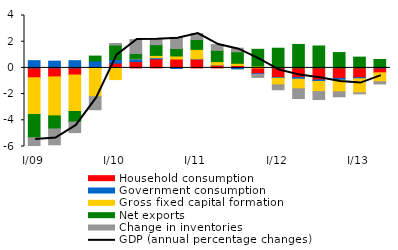
| Category | Household consumption | Government consumption | Gross fixed capital formation | Net exports | Change in inventories |
|---|---|---|---|---|---|
| I/09 | -0.752 | 0.551 | -2.809 | -1.77 | -0.69 |
| II | -0.686 | 0.517 | -2.976 | -0.996 | -1.21 |
| III | -0.544 | 0.549 | -2.783 | -0.804 | -0.809 |
| IV | -0.023 | 0.526 | -2.17 | 0.375 | -1 |
| I/10 | 0.364 | 0.283 | -0.89 | 1.1 | 0.115 |
| II | 0.489 | 0.207 | 0.031 | 0.374 | 1.063 |
| III | 0.686 | 0.089 | 0.18 | 0.818 | 0.41 |
| IV | 0.678 | -0.039 | 0.233 | 0.568 | 0.821 |
| I/11 | 0.672 | 0.02 | 0.724 | 0.751 | 0.452 |
| II | 0.216 | 0.004 | 0.258 | 0.857 | 0.443 |
| III | 0.182 | -0.076 | 0.172 | 0.877 | 0.276 |
| IV | -0.455 | -0.028 | 0.145 | 1.272 | -0.245 |
| I/12 | -0.725 | -0.059 | -0.512 | 1.502 | -0.371 |
| II | -0.731 | -0.135 | -0.73 | 1.79 | -0.743 |
| III | -0.922 | -0.119 | -0.769 | 1.672 | -0.607 |
| IV | -0.802 | -0.143 | -0.882 | 1.17 | -0.378 |
| I/13 | -0.745 | -0.083 | -1.075 | 0.822 | -0.078 |
| II | -0.375 | 0.058 | -0.686 | 0.582 | -0.166 |